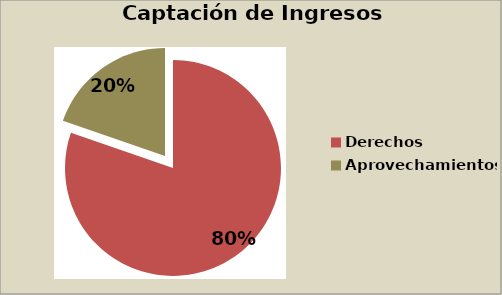
| Category | Series 0 |
|---|---|
| Derechos | 79.916 |
| Aprovechamientos | 19.618 |